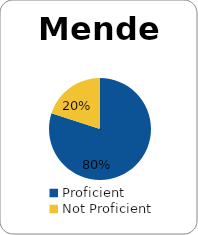
| Category | Series 0 |
|---|---|
| Proficient | 0.8 |
| Not Proficient | 0.2 |